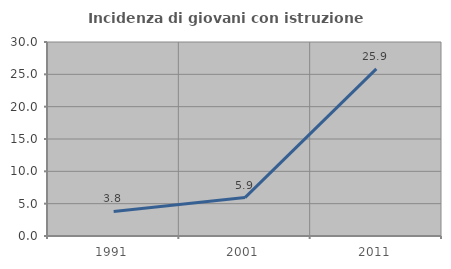
| Category | Incidenza di giovani con istruzione universitaria |
|---|---|
| 1991.0 | 3.797 |
| 2001.0 | 5.941 |
| 2011.0 | 25.85 |